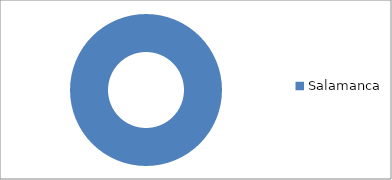
| Category | Series 0 |
|---|---|
| Salamanca | 5 |